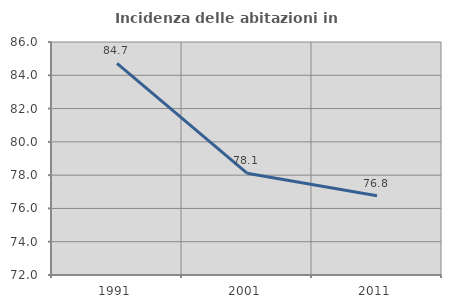
| Category | Incidenza delle abitazioni in proprietà  |
|---|---|
| 1991.0 | 84.71 |
| 2001.0 | 78.117 |
| 2011.0 | 76.768 |